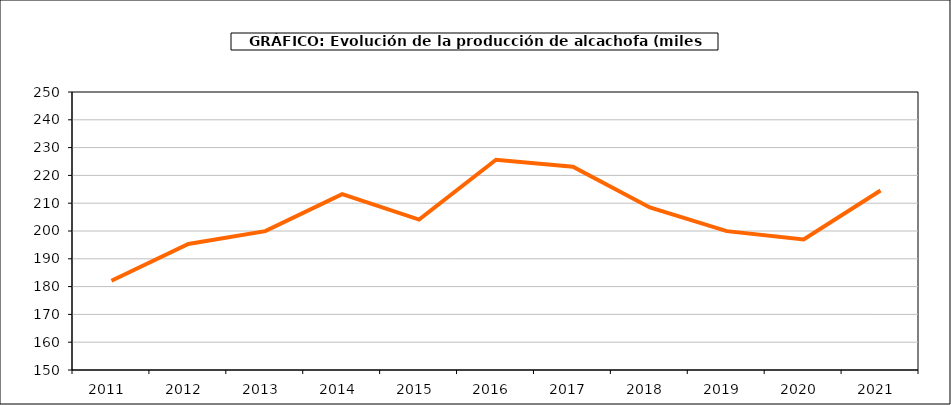
| Category | producción |
|---|---|
| 2011.0 | 182.1 |
| 2012.0 | 195.342 |
| 2013.0 | 199.945 |
| 2014.0 | 213.258 |
| 2015.0 | 204.111 |
| 2016.0 | 225.616 |
| 2017.0 | 223.15 |
| 2018.0 | 208.463 |
| 2019.0 | 199.944 |
| 2020.0 | 196.965 |
| 2021.0 | 214.555 |